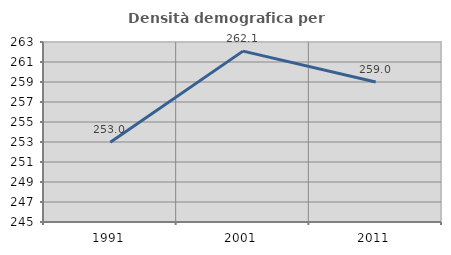
| Category | Densità demografica |
|---|---|
| 1991.0 | 252.977 |
| 2001.0 | 262.088 |
| 2011.0 | 258.998 |